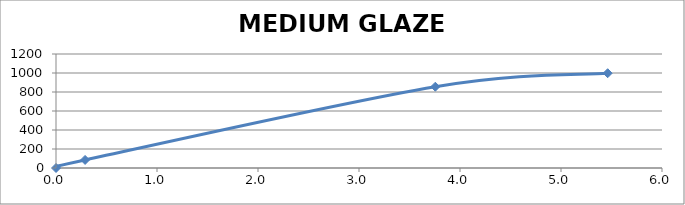
| Category | MEDIUM GLAZE CHART |
|---|---|
| 0.0 | 0 |
| 0.288 | 85 |
| 3.755500999999999 | 855.556 |
| 5.462164999999999 | 997.778 |